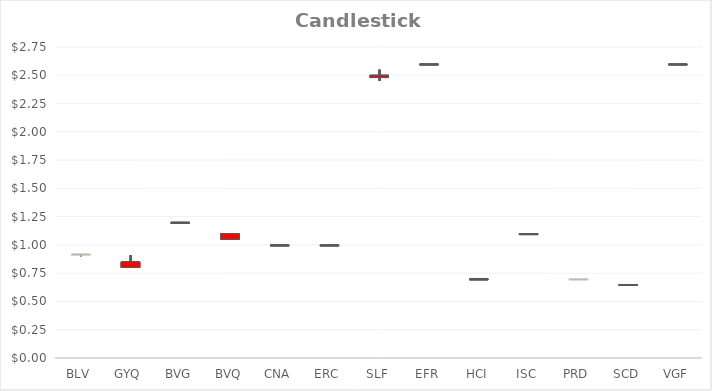
| Category | Open | High | Low | Close |
|---|---|---|---|---|
| BLV | 0.91 | 0.92 | 0.9 | 0.92 |
| GYQ | 0.85 | 0.91 | 0.8 | 0.8 |
| BVG | 1.2 | 1.2 | 1.2 | 1.2 |
| BVQ | 1.1 | 1.1 | 1.05 | 1.05 |
| CNA | 1 | 1 | 1 | 1 |
| ERC | 1 | 1 | 1 | 1 |
| SLF | 2.5 | 2.55 | 2.45 | 2.48 |
| EFR | 2.6 | 2.6 | 2.6 | 2.6 |
| HCI | 0.7 | 0.7 | 0.7 | 0.7 |
| ISC | 1.1 | 1.1 | 1.1 | 1.1 |
| PRD | 0.69 | 0.7 | 0.69 | 0.7 |
| SCD | 0.65 | 0.65 | 0.65 | 0.65 |
| VGF | 2.6 | 2.6 | 2.6 | 2.6 |